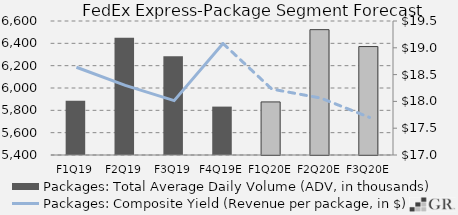
| Category | Packages: Total Average Daily Volume (ADV, in thousands) |
|---|---|
|  F1Q19  | 5886.7 |
|  F2Q19  | 6449.5 |
|  F3Q19  | 6283.4 |
|  F4Q19E  | 5833.399 |
|  F1Q20E  | 5875.378 |
|  F2Q20E  | 6522.576 |
|  F3Q20E  | 6371.22 |